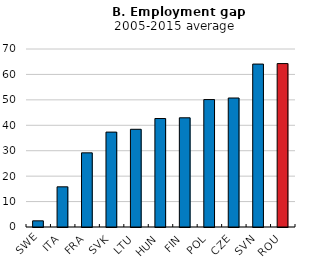
| Category | Series 0 |
|---|---|
| SWE | 2.425 |
| ITA | 15.8 |
| FRA | 29.163 |
| SVK | 37.317 |
| LTU | 38.428 |
| HUN | 42.659 |
| FIN | 42.941 |
| POL | 50.115 |
| CZE | 50.726 |
| SVN | 64.073 |
| ROU | 64.262 |